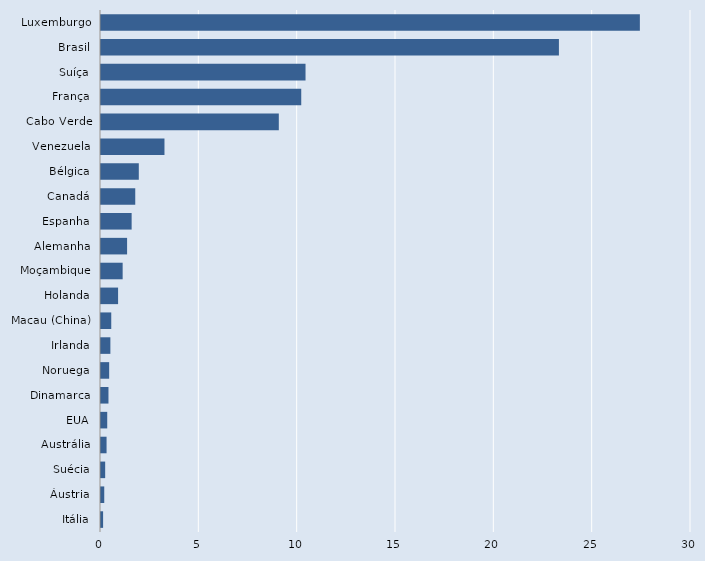
| Category | Series 0 |
|---|---|
| Itália | 0.107 |
| Áustria | 0.165 |
| Suécia | 0.212 |
| Austrália | 0.283 |
| EUA | 0.317 |
| Dinamarca | 0.38 |
| Noruega | 0.415 |
| Irlanda | 0.477 |
| Macau (China) | 0.521 |
| Holanda | 0.869 |
| Moçambique | 1.101 |
| Alemanha | 1.326 |
| Espanha | 1.558 |
| Canadá | 1.742 |
| Bélgica | 1.922 |
| Venezuela | 3.227 |
| Cabo Verde | 9.041 |
| França | 10.182 |
| Suíça | 10.4 |
| Brasil | 23.284 |
| Luxemburgo | 27.4 |